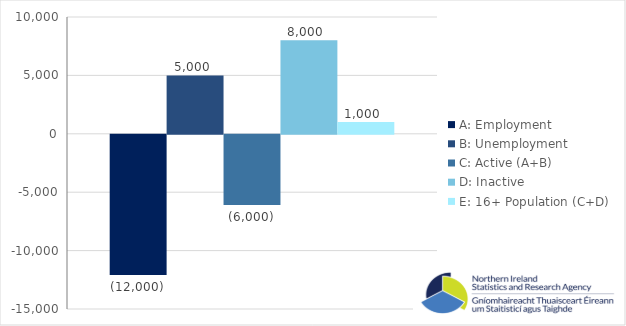
| Category | A: Employment | B: Unemployment | C: Active (A+B) | D: Inactive | E: 16+ Population (C+D) |
|---|---|---|---|---|---|
| 0 | -12000 | 5000 | -6000 | 8000 | 1000 |